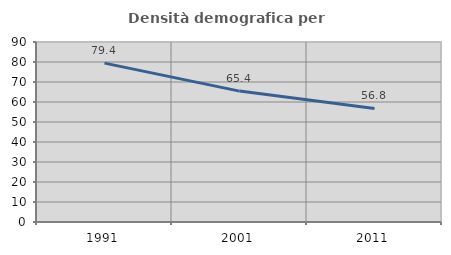
| Category | Densità demografica |
|---|---|
| 1991.0 | 79.442 |
| 2001.0 | 65.447 |
| 2011.0 | 56.803 |